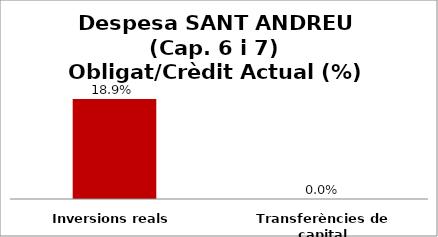
| Category | Series 0 |
|---|---|
| Inversions reals | 0.189 |
| Transferències de capital | 0 |